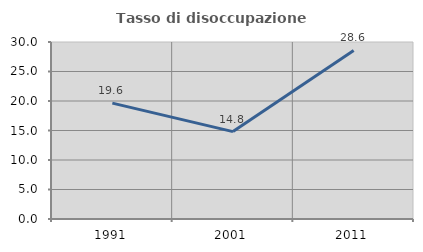
| Category | Tasso di disoccupazione giovanile  |
|---|---|
| 1991.0 | 19.643 |
| 2001.0 | 14.815 |
| 2011.0 | 28.571 |